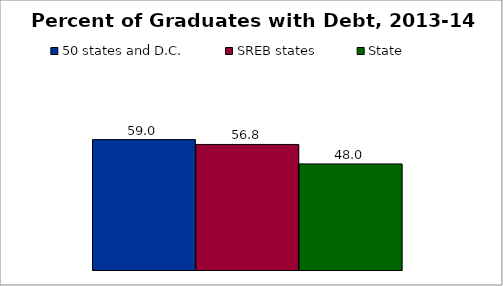
| Category | 50 states and D.C. | SREB states | State |
|---|---|---|---|
| 0 | 59 | 56.812 | 48 |